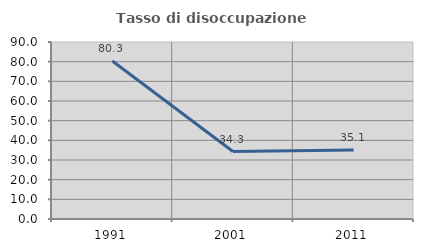
| Category | Tasso di disoccupazione giovanile  |
|---|---|
| 1991.0 | 80.342 |
| 2001.0 | 34.286 |
| 2011.0 | 35.088 |